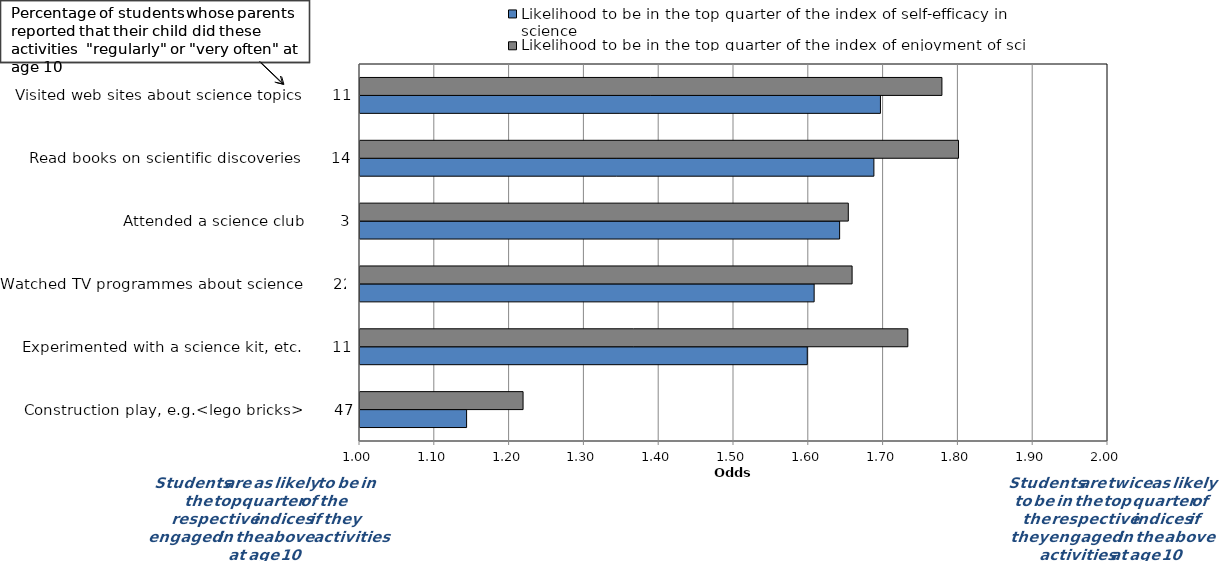
| Category | Likelihood to be in the top quarter of the index of self-efficacy in science | Likelihood to be in the top quarter of the index of enjoyment of science |
|---|---|---|
| Construction play, e.g.<lego bricks>      47 | 1.143 | 1.218 |
| Experimented with a science kit, etc.      11 | 1.598 | 1.732 |
| Watched TV programmes about science      22 | 1.607 | 1.658 |
| Attended a science club       3 | 1.641 | 1.653 |
| Read books on scientific discoveries      14 | 1.687 | 1.8 |
| Visited web sites about science topics      11 | 1.696 | 1.778 |